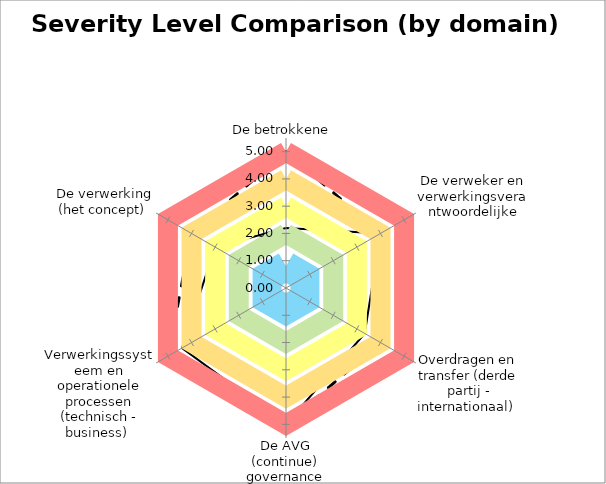
| Category | Average | Max | B | G | Y | O | R |
|---|---|---|---|---|---|---|---|
| De betrokkene  | 2.2 | 5 | 0.8 | 2 | 3 | 4 | 5 |
| De verweker en verwerkingsverantwoordelijke | 4 | 4 | 0.8 | 2 | 3 | 4 | 5 |
| Overdragen en transfer (derde partij - internationaal)  | 3.333 | 4 | 0.8 | 2 | 3 | 4 | 5 |
| De AVG (continue) governance | 5 | 5 | 0.8 | 2 | 3 | 4 | 5 |
| Verwerkingssysteem en operationele processen (technisch - business)  | 4.4 | 5 | 0.8 | 2 | 3 | 4 | 5 |
| De verwerking (het concept)  | 3 | 4 | 0.8 | 2 | 3 | 4 | 5 |